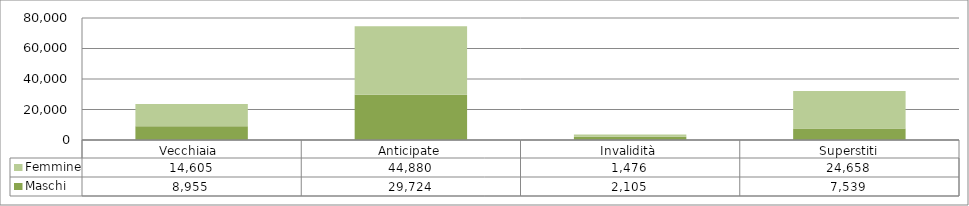
| Category | Maschi | Femmine |
|---|---|---|
| Vecchiaia  | 8955 | 14605 |
| Anticipate | 29724 | 44880 |
| Invalidità | 2105 | 1476 |
| Superstiti | 7539 | 24658 |